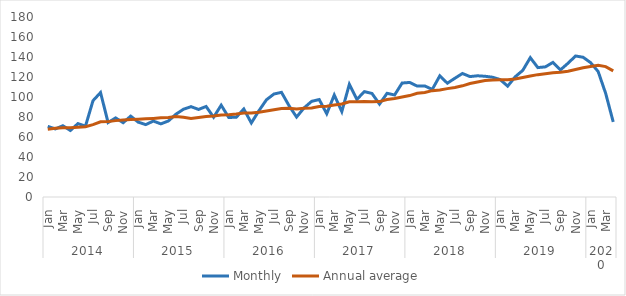
| Category | Monthly | Annual average |
|---|---|---|
| 0 | 70.677 | 67.643 |
| 1 | 68.059 | 68.683 |
| 2 | 71.261 | 69.278 |
| 3 | 66.507 | 69.237 |
| 4 | 73.414 | 69.675 |
| 5 | 70.835 | 70.272 |
| 6 | 96.314 | 72.315 |
| 7 | 104.46 | 75.188 |
| 8 | 74.459 | 75.375 |
| 9 | 79.096 | 76.377 |
| 10 | 74.297 | 76.993 |
| 11 | 80.87 | 77.521 |
| 12 | 74.827 | 77.866 |
| 13 | 72.399 | 78.228 |
| 14 | 75.938 | 78.618 |
| 15 | 73.145 | 79.171 |
| 16 | 76.042 | 79.39 |
| 17 | 82.803 | 80.388 |
| 18 | 87.763 | 79.675 |
| 19 | 90.343 | 78.498 |
| 20 | 87.562 | 79.59 |
| 21 | 90.532 | 80.543 |
| 22 | 79.77 | 80.999 |
| 23 | 91.811 | 81.911 |
| 24 | 79.566 | 82.306 |
| 25 | 79.699 | 82.915 |
| 26 | 88.034 | 83.922 |
| 27 | 74.047 | 83.998 |
| 28 | 86.193 | 84.843 |
| 29 | 97.186 | 86.042 |
| 30 | 102.989 | 87.311 |
| 31 | 104.663 | 88.504 |
| 32 | 91.312 | 88.817 |
| 33 | 79.952 | 87.935 |
| 34 | 89.137 | 88.716 |
| 35 | 95.667 | 89.037 |
| 36 | 97.461 | 90.528 |
| 37 | 83.276 | 90.826 |
| 38 | 101.97 | 91.988 |
| 39 | 85.42 | 92.935 |
| 40 | 112.676 | 95.142 |
| 41 | 97.697 | 95.185 |
| 42 | 105.375 | 95.384 |
| 43 | 103.549 | 95.291 |
| 44 | 92.906 | 95.424 |
| 45 | 103.694 | 97.402 |
| 46 | 102.006 | 98.475 |
| 47 | 113.97 | 100 |
| 48 | 114.546 | 101.424 |
| 49 | 110.919 | 103.727 |
| 50 | 111.041 | 104.483 |
| 51 | 107.605 | 106.332 |
| 52 | 121.186 | 107.041 |
| 53 | 113.788 | 108.382 |
| 54 | 118.755 | 109.497 |
| 55 | 123.521 | 111.161 |
| 56 | 120.415 | 113.454 |
| 57 | 121.214 | 114.914 |
| 58 | 120.728 | 116.474 |
| 59 | 119.775 | 116.958 |
| 60 | 117.425 | 117.198 |
| 61 | 110.849 | 117.192 |
| 62 | 120.23 | 117.958 |
| 63 | 126.62 | 119.542 |
| 64 | 139.338 | 121.055 |
| 65 | 129.417 | 122.357 |
| 66 | 130.134 | 123.306 |
| 67 | 134.581 | 124.227 |
| 68 | 127.099 | 124.784 |
| 69 | 133.761 | 125.83 |
| 70 | 140.999 | 127.519 |
| 71 | 139.769 | 129.185 |
| 72 | 134.344 | 130.595 |
| 73 | 125.485 | 131.815 |
| 74 | 103.546 | 130.424 |
| 75 | 75.037 | 126.126 |